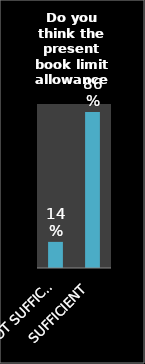
| Category | Series 0 |
|---|---|
| NOT SUFFICIENT | 0.143 |
| SUFFICIENT | 0.857 |